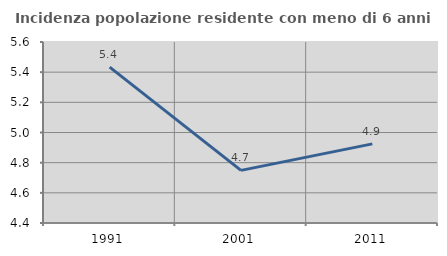
| Category | Incidenza popolazione residente con meno di 6 anni |
|---|---|
| 1991.0 | 5.433 |
| 2001.0 | 4.749 |
| 2011.0 | 4.925 |